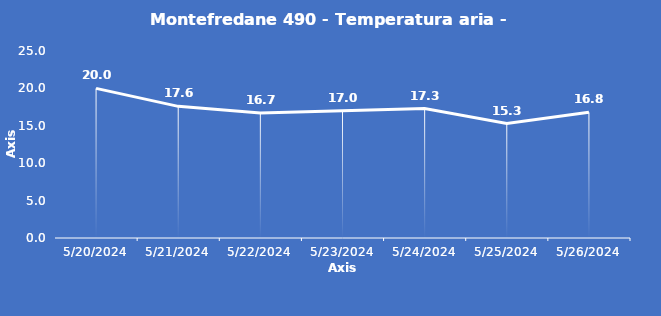
| Category | Montefredane 490 - Temperatura aria - Grezzo (°C) |
|---|---|
| 5/20/24 | 20 |
| 5/21/24 | 17.6 |
| 5/22/24 | 16.7 |
| 5/23/24 | 17 |
| 5/24/24 | 17.3 |
| 5/25/24 | 15.3 |
| 5/26/24 | 16.8 |